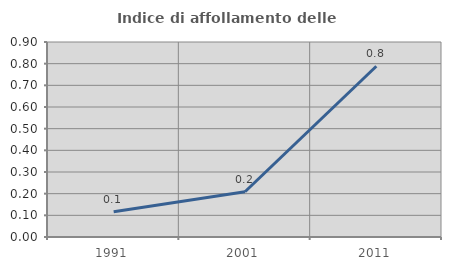
| Category | Indice di affollamento delle abitazioni  |
|---|---|
| 1991.0 | 0.117 |
| 2001.0 | 0.209 |
| 2011.0 | 0.788 |